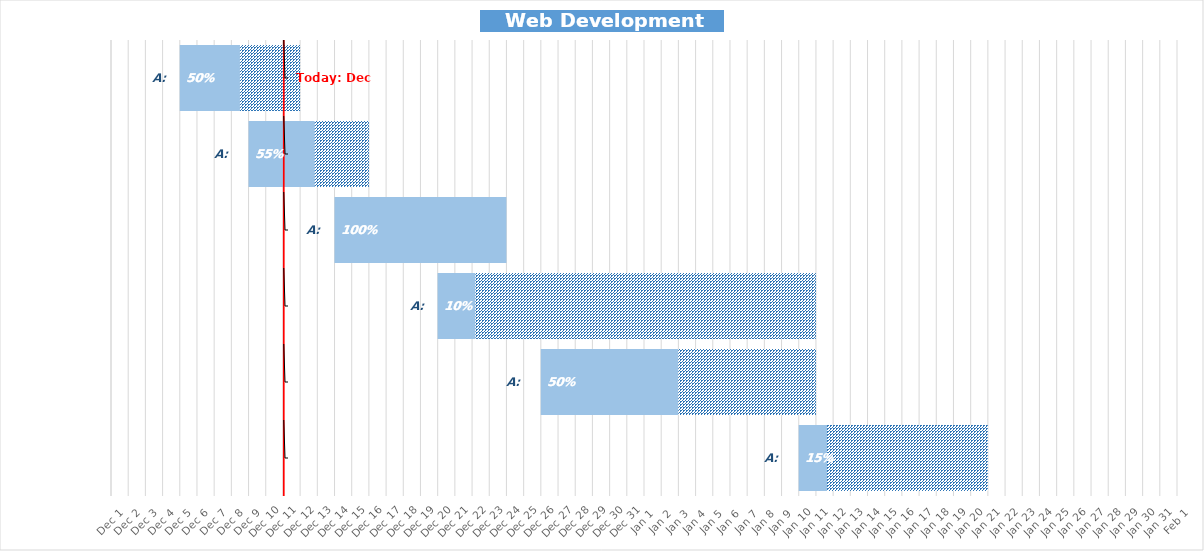
| Category | Series 0 | Progress | Remaining |
|---|---|---|---|
| Idea | 2021-12-05 | 3.5 | 3.5 |
| Screening | 2021-12-09 | 3.85 | 3.15 |
| Concept | 2021-12-14 | 10 | 0 |
| Product  | 2021-12-20 | 2.2 | 19.8 |
| Market testing | 2021-12-26 | 8 | 8 |
| Market  | 2022-01-10 | 1.65 | 9.35 |